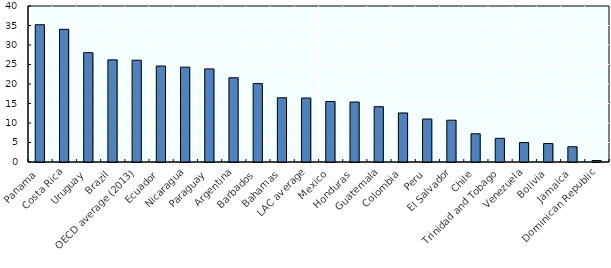
| Category | Series 0 |
|---|---|
| Panama | 35.193 |
| Costa Rica | 34.023 |
| Uruguay | 28.021 |
| Brazil | 26.192 |
| OECD average (2013) | 26.1 |
| Ecuador | 24.602 |
| Nicaragua | 24.324 |
| Paraguay | 23.872 |
| Argentina | 21.597 |
| Barbados | 20.103 |
| Bahamas | 16.467 |
| LAC average | 16.413 |
| Mexico | 15.506 |
| Honduras | 15.379 |
| Guatemala | 14.18 |
| Colombia | 12.575 |
| Peru | 11.015 |
| El Salvador | 10.718 |
| Chile | 7.233 |
| Trinidad and Tobago | 6.068 |
| Venezuela | 4.979 |
| Bolivia | 4.731 |
| Jamaica | 3.912 |
| Dominican Republic | 0.385 |